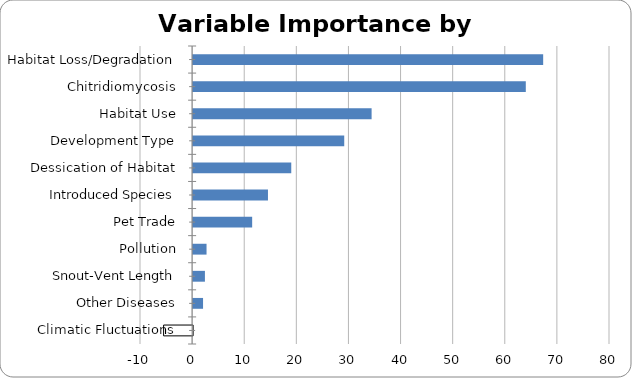
| Category | Series 0 |
|---|---|
| Habitat Loss/Degradation | 67.175 |
| Chitridiomycosis | 63.842 |
| Habitat Use | 34.253 |
| Development Type | 29.001 |
| Dessication of Habitat | 18.835 |
| Introduced Species | 14.365 |
| Pet Trade | 11.333 |
| Pollution | 2.577 |
| Snout-Vent Length | 2.267 |
| Other Diseases | 1.907 |
| Climatic Fluctuations | -5.567 |